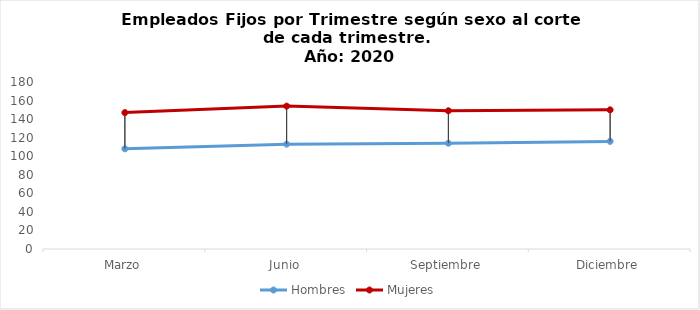
| Category | Hombres | Mujeres |
|---|---|---|
| Marzo | 108 | 147 |
| Junio | 113 | 154 |
| Septiembre | 114 | 149 |
| Diciembre | 116 | 150 |